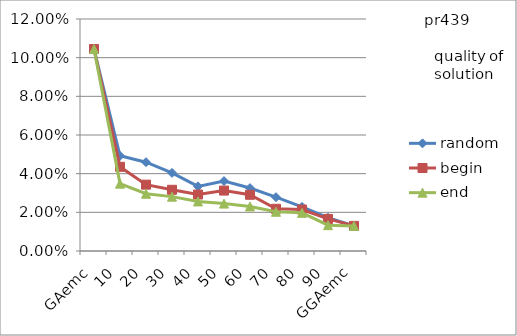
| Category | random | begin | end |
|---|---|---|---|
| 0 | 0.104 | 0.104 | 0.104 |
| 1 | 0.049 | 0.044 | 0.035 |
| 2 | 0.046 | 0.034 | 0.03 |
| 3 | 0.04 | 0.032 | 0.028 |
| 4 | 0.033 | 0.029 | 0.026 |
| 5 | 0.036 | 0.031 | 0.025 |
| 6 | 0.033 | 0.029 | 0.023 |
| 7 | 0.028 | 0.022 | 0.02 |
| 8 | 0.023 | 0.021 | 0.02 |
| 9 | 0.017 | 0.017 | 0.013 |
| 10 | 0.013 | 0.013 | 0.013 |